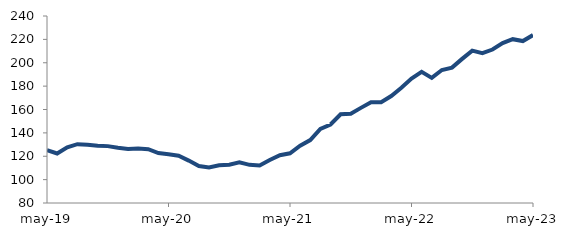
| Category | Series 0 |
|---|---|
| 2019-05-01 | 125.115 |
| 2019-06-01 | 122.365 |
| 2019-07-01 | 127.653 |
| 2019-08-01 | 130.323 |
| 2019-09-01 | 129.814 |
| 2019-10-01 | 129.013 |
| 2019-11-01 | 128.663 |
| 2019-12-01 | 127.192 |
| 2020-01-01 | 126.144 |
| 2020-02-01 | 126.638 |
| 2020-03-01 | 125.992 |
| 2020-04-01 | 122.726 |
| 2020-05-01 | 121.669 |
| 2020-06-01 | 120.485 |
| 2020-07-01 | 116.268 |
| 2020-08-01 | 111.597 |
| 2020-09-01 | 110.39 |
| 2020-10-01 | 112.229 |
| 2020-11-01 | 112.769 |
| 2020-12-01 | 114.741 |
| 2021-01-01 | 112.625 |
| 2021-02-01 | 112.14 |
| 2021-03-01 | 116.74 |
| 2021-04-01 | 120.911 |
| 2021-05-01 | 122.536 |
| 2021-06-01 | 128.968 |
| 2021-07-01 | 133.864 |
| 2021-08-01 | 143.384 |
| 2021-09-01 | 147.196 |
| 2021-10-01 | 155.883 |
| 2021-11-01 | 156.426 |
| 2021-12-01 | 161.4 |
| 2022-01-01 | 166.276 |
| 2022-02-01 | 166.219 |
| 2022-03-01 | 171.531 |
| 2022-04-01 | 178.644 |
| 2022-05-01 | 186.465 |
| 2022-06-01 | 192.187 |
| 2022-07-01 | 187.044 |
| 2022-08-01 | 193.806 |
| 2022-09-01 | 195.846 |
| 2022-10-01 | 203.287 |
| 2022-11-01 | 210.344 |
| 2022-12-01 | 208.16 |
| 2023-01-01 | 211.29 |
| 2023-02-01 | 216.772 |
| 2023-03-01 | 220.156 |
| 2023-04-01 | 218.537 |
| 2023-05-01 | 223.702 |